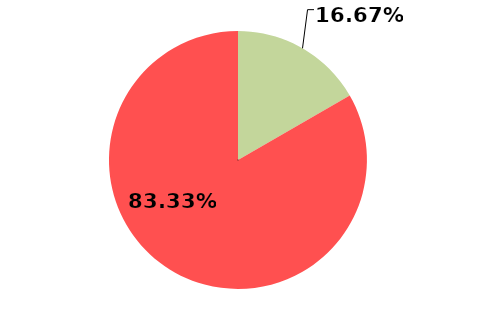
| Category | Series 0 |
|---|---|
| 0 | 0.167 |
| 1 | 0.833 |